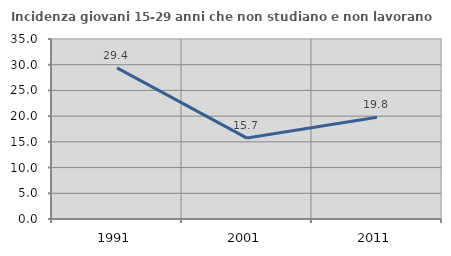
| Category | Incidenza giovani 15-29 anni che non studiano e non lavorano  |
|---|---|
| 1991.0 | 29.388 |
| 2001.0 | 15.736 |
| 2011.0 | 19.765 |